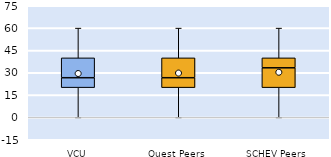
| Category | 25th | 50th | 75th |
|---|---|---|---|
| VCU | 20 | 6.667 | 13.333 |
| Quest Peers | 20 | 6.667 | 13.333 |
| SCHEV Peers | 20 | 13.333 | 6.667 |